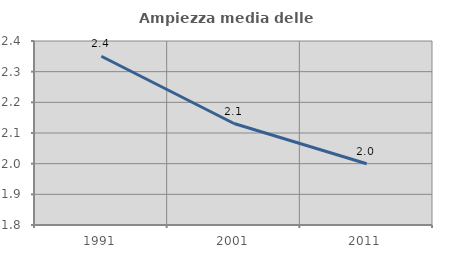
| Category | Ampiezza media delle famiglie |
|---|---|
| 1991.0 | 2.35 |
| 2001.0 | 2.131 |
| 2011.0 | 2 |